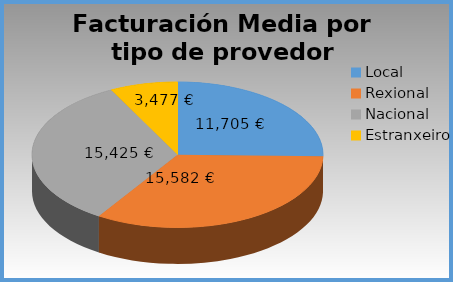
| Category | Facturación Media por tipo de provedor |
|---|---|
| Local | 11704.979 |
| Rexional | 15582.164 |
| Nacional | 15425.315 |
| Estranxeiro | 3476.936 |